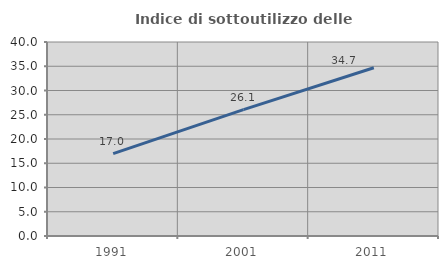
| Category | Indice di sottoutilizzo delle abitazioni  |
|---|---|
| 1991.0 | 16.998 |
| 2001.0 | 26.071 |
| 2011.0 | 34.694 |